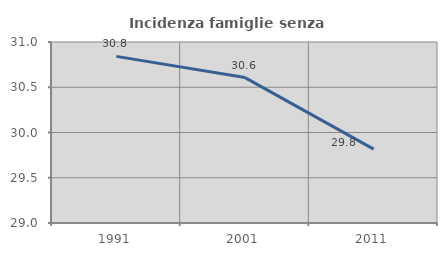
| Category | Incidenza famiglie senza nuclei |
|---|---|
| 1991.0 | 30.841 |
| 2001.0 | 30.607 |
| 2011.0 | 29.817 |